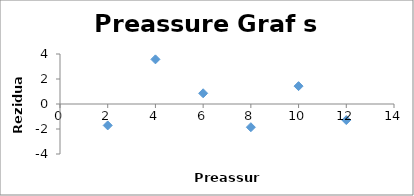
| Category | Series 0 |
|---|---|
| 2.0 | -1.714 |
| 4.0 | 3.571 |
| 6.0 | 0.857 |
| 8.0 | -1.857 |
| 10.0 | 1.429 |
| 12.0 | -1.286 |